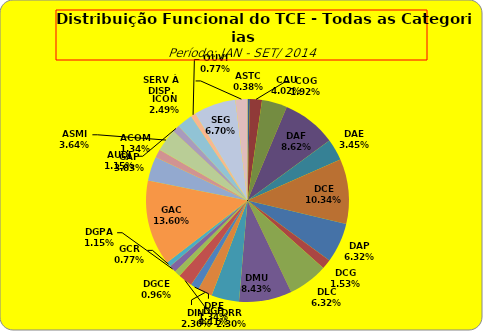
| Category | ASTC COG CAU DAF DAE DCE DAP DCG DLC DMU DGP DIN DPE DRR DGCE DGPA GCR GAC GAP ACOM ASMI AUDI ICON OUVI SEG SERV À DISP. |
|---|---|
| ASTC | 2 |
| COG | 10 |
| CAU | 21 |
| DAF | 45 |
| DAE | 18 |
| DCE | 54 |
| DAP | 33 |
| DCG | 8 |
| DLC | 33 |
| DMU | 44 |
| DGP | 23 |
| DIN | 12 |
| DPE | 7 |
| DRR | 12 |
| DGCE | 5 |
| DGPA | 6 |
| GCR | 4 |
| GAC | 71 |
| GAP | 20 |
| ACOM | 7 |
| ASMI | 19 |
| AUDI | 6 |
| ICON | 13 |
| OUVI | 4 |
| SEG | 35 |
| SERV À DISP. | 10 |